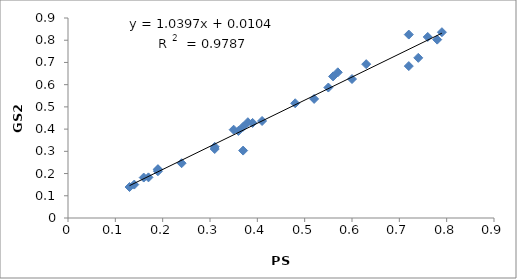
| Category | Series 0 |
|---|---|
| 0.17 | 0.183 |
| 0.19 | 0.217 |
| 0.13 | 0.139 |
| 0.37 | 0.411 |
| 0.38 | 0.431 |
| 0.14 | 0.15 |
| 0.31 | 0.32 |
| 0.72 | 0.684 |
| 0.76 | 0.815 |
| 0.37 | 0.303 |
| 0.48 | 0.516 |
| 0.39 | 0.428 |
| 0.35 | 0.397 |
| 0.36 | 0.392 |
| 0.52 | 0.536 |
| 0.57 | 0.656 |
| 0.55 | 0.587 |
| 0.63 | 0.692 |
| 0.56 | 0.637 |
| 0.6 | 0.625 |
| 0.72 | 0.825 |
| 0.78 | 0.803 |
| 0.74 | 0.721 |
| 0.79 | 0.836 |
| 0.41 | 0.437 |
| 0.19 | 0.21 |
| 0.24 | 0.247 |
| 0.31 | 0.31 |
| 0.16 | 0.182 |
| 0.19 | 0.22 |